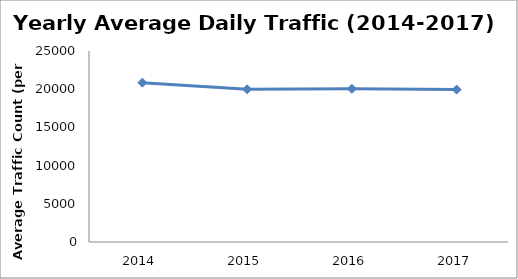
| Category | Series 0 |
|---|---|
| 2014.0 | 20858.748 |
| 2015.0 | 19988.937 |
| 2016.0 | 20047.669 |
| 2017.0 | 19952.175 |